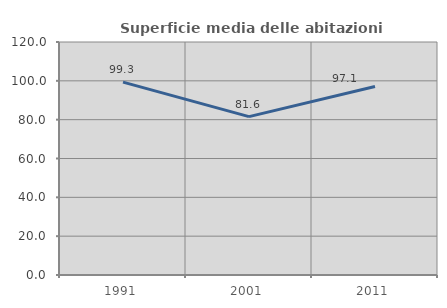
| Category | Superficie media delle abitazioni occupate |
|---|---|
| 1991.0 | 99.329 |
| 2001.0 | 81.561 |
| 2011.0 | 97.082 |